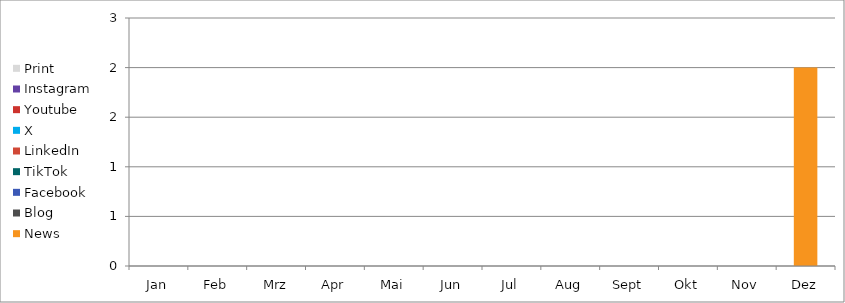
| Category | News | Blog | Facebook | TikTok | LinkedIn | X | Youtube | Instagram | Print |
|---|---|---|---|---|---|---|---|---|---|
| Jan | 0 | 0 | 0 | 0 | 0 | 0 | 0 | 0 | 0 |
| Feb | 0 | 0 | 0 | 0 | 0 | 0 | 0 | 0 | 0 |
| Mrz | 0 | 0 | 0 | 0 | 0 | 0 | 0 | 0 | 0 |
| Apr | 0 | 0 | 0 | 0 | 0 | 0 | 0 | 0 | 0 |
| Mai | 0 | 0 | 0 | 0 | 0 | 0 | 0 | 0 | 0 |
| Jun | 0 | 0 | 0 | 0 | 0 | 0 | 0 | 0 | 0 |
| Jul | 0 | 0 | 0 | 0 | 0 | 0 | 0 | 0 | 0 |
| Aug | 0 | 0 | 0 | 0 | 0 | 0 | 0 | 0 | 0 |
| Sept | 0 | 0 | 0 | 0 | 0 | 0 | 0 | 0 | 0 |
| Okt | 0 | 0 | 0 | 0 | 0 | 0 | 0 | 0 | 0 |
| Nov | 0 | 0 | 0 | 0 | 0 | 0 | 0 | 0 | 0 |
| Dez | 2 | 0 | 0 | 0 | 0 | 0 | 0 | 0 | 0 |